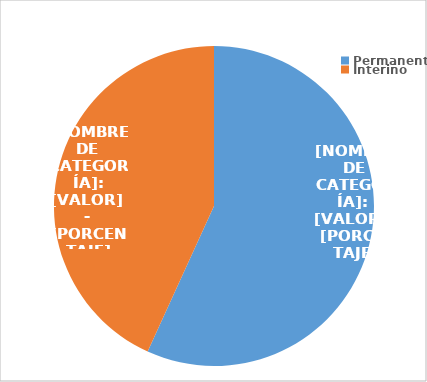
| Category | Series 0 |
|---|---|
| Permanente | 3209 |
| Interino | 2440 |